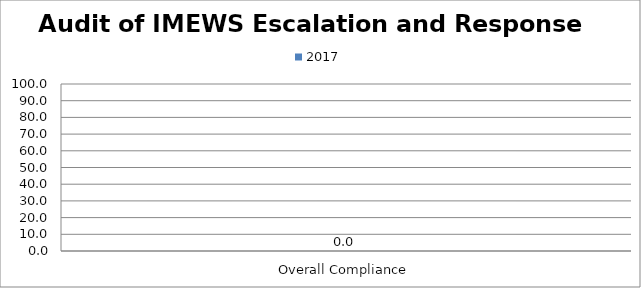
| Category | 2017 |
|---|---|
| Overall Compliance | 0 |